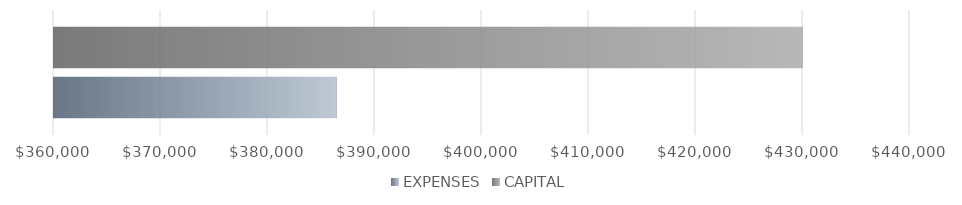
| Category | EXPENSES | CAPITAL |
|---|---|---|
| 0 | 386400 | 430000 |